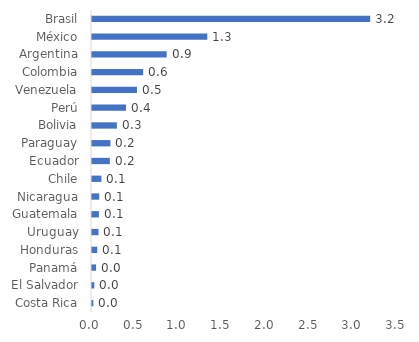
| Category | Series 0 |
|---|---|
| Costa Rica | 0.015 |
| El Salvador | 0.026 |
| Panamá | 0.046 |
| Honduras | 0.06 |
| Uruguay | 0.074 |
| Guatemala | 0.08 |
| Nicaragua | 0.083 |
| Chile | 0.108 |
| Ecuador | 0.204 |
| Paraguay | 0.211 |
| Bolivia | 0.285 |
| Perú | 0.389 |
| Venezuela | 0.514 |
| Colombia | 0.585 |
| Argentina | 0.855 |
| México | 1.319 |
| Brasil | 3.182 |